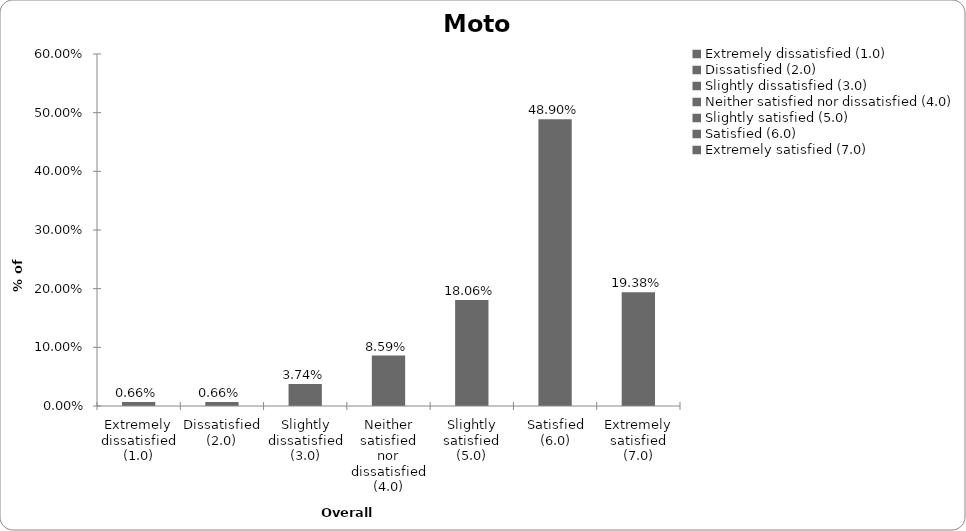
| Category | Motor |
|---|---|
| Extremely dissatisfied (1.0) | 0.007 |
| Dissatisfied (2.0) | 0.007 |
| Slightly dissatisfied (3.0) | 0.037 |
| Neither satisfied nor dissatisfied (4.0) | 0.086 |
| Slightly satisfied (5.0) | 0.181 |
| Satisfied (6.0) | 0.489 |
| Extremely satisfied (7.0) | 0.194 |